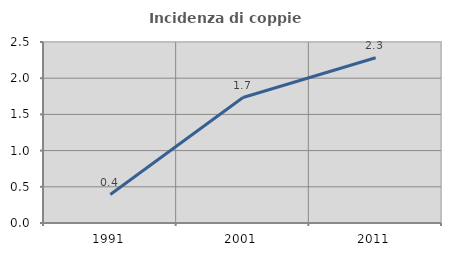
| Category | Incidenza di coppie miste |
|---|---|
| 1991.0 | 0.393 |
| 2001.0 | 1.733 |
| 2011.0 | 2.282 |